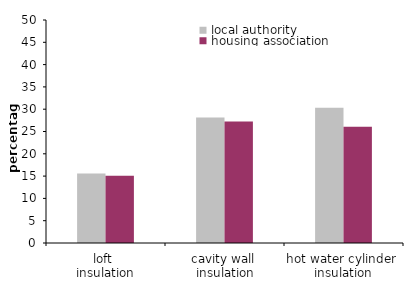
| Category | local authority | housing association |
|---|---|---|
| loft 
insulation | 15.575 | 15.079 |
| cavity wall 
insulation | 28.148 | 27.253 |
| hot water cylinder 
insulation | 30.332 | 26.073 |